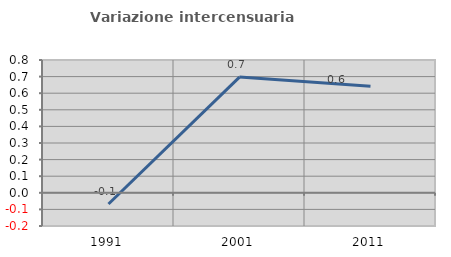
| Category | Variazione intercensuaria annua |
|---|---|
| 1991.0 | -0.067 |
| 2001.0 | 0.697 |
| 2011.0 | 0.642 |